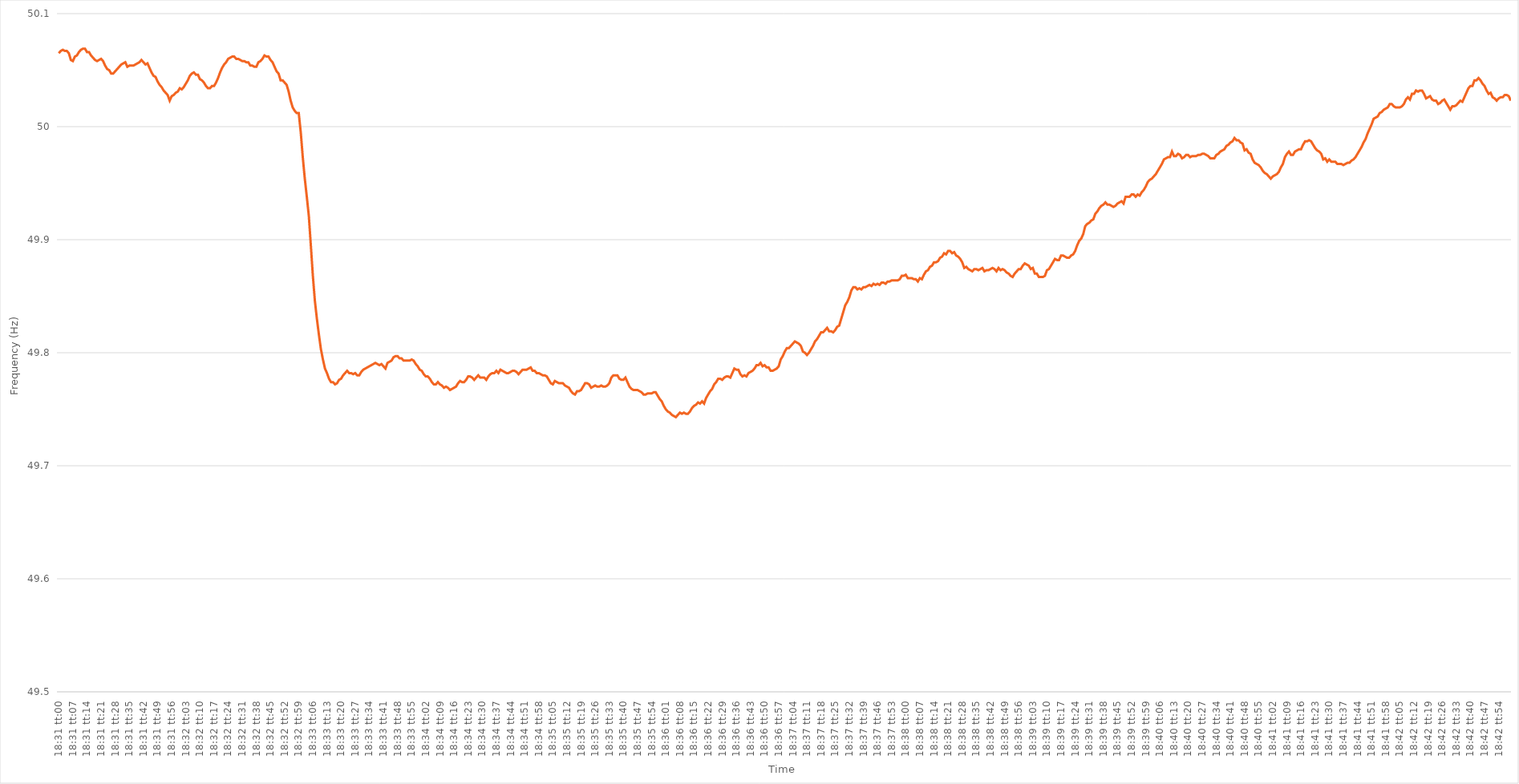
| Category | Series 0 |
|---|---|
| 0.7715277777777777 | 50.065 |
| 0.7715393518518519 | 50.067 |
| 0.771550925925926 | 50.068 |
| 0.7715624999999999 | 50.067 |
| 0.7715740740740741 | 50.067 |
| 0.7715856481481481 | 50.065 |
| 0.7715972222222223 | 50.059 |
| 0.7716087962962962 | 50.058 |
| 0.7716203703703703 | 50.062 |
| 0.7716319444444445 | 50.063 |
| 0.7716435185185185 | 50.066 |
| 0.7716550925925926 | 50.068 |
| 0.7716666666666666 | 50.069 |
| 0.7716782407407408 | 50.069 |
| 0.7716898148148149 | 50.066 |
| 0.7717013888888888 | 50.066 |
| 0.771712962962963 | 50.063 |
| 0.771724537037037 | 50.061 |
| 0.7717361111111112 | 50.059 |
| 0.7717476851851851 | 50.058 |
| 0.7717592592592593 | 50.059 |
| 0.7717708333333334 | 50.06 |
| 0.7717824074074073 | 50.058 |
| 0.7717939814814815 | 50.054 |
| 0.7718055555555555 | 50.051 |
| 0.7718171296296297 | 50.05 |
| 0.7718287037037036 | 50.047 |
| 0.7718402777777778 | 50.047 |
| 0.7718518518518519 | 50.049 |
| 0.7718634259259259 | 50.051 |
| 0.771875 | 50.053 |
| 0.771886574074074 | 50.055 |
| 0.7718981481481482 | 50.056 |
| 0.7719097222222223 | 50.057 |
| 0.7719212962962962 | 50.053 |
| 0.7719328703703704 | 50.054 |
| 0.7719444444444444 | 50.054 |
| 0.7719560185185186 | 50.054 |
| 0.7719675925925925 | 50.055 |
| 0.7719791666666667 | 50.056 |
| 0.7719907407407408 | 50.057 |
| 0.7720023148148148 | 50.059 |
| 0.7720138888888889 | 50.057 |
| 0.7720254629629629 | 50.055 |
| 0.7720370370370371 | 50.056 |
| 0.772048611111111 | 50.052 |
| 0.7720601851851852 | 50.048 |
| 0.7720717592592593 | 50.045 |
| 0.7720833333333333 | 50.044 |
| 0.7720949074074074 | 50.04 |
| 0.7721064814814814 | 50.037 |
| 0.7721180555555556 | 50.035 |
| 0.7721296296296297 | 50.032 |
| 0.7721412037037036 | 50.03 |
| 0.7721527777777778 | 50.028 |
| 0.7721643518518518 | 50.023 |
| 0.772175925925926 | 50.027 |
| 0.7721874999999999 | 50.028 |
| 0.7721990740740741 | 50.03 |
| 0.7722106481481482 | 50.031 |
| 0.7722222222222223 | 50.034 |
| 0.7722337962962963 | 50.033 |
| 0.7722453703703703 | 50.035 |
| 0.7722569444444445 | 50.038 |
| 0.7722685185185186 | 50.041 |
| 0.7722800925925926 | 50.045 |
| 0.7722916666666667 | 50.047 |
| 0.7723032407407407 | 50.048 |
| 0.7723148148148148 | 50.046 |
| 0.7723263888888888 | 50.046 |
| 0.772337962962963 | 50.042 |
| 0.7723495370370371 | 50.041 |
| 0.772361111111111 | 50.039 |
| 0.7723726851851852 | 50.036 |
| 0.7723842592592592 | 50.034 |
| 0.7723958333333334 | 50.034 |
| 0.7724074074074073 | 50.036 |
| 0.7724189814814815 | 50.036 |
| 0.7724305555555556 | 50.039 |
| 0.7724421296296297 | 50.043 |
| 0.7724537037037037 | 50.048 |
| 0.7724652777777777 | 50.052 |
| 0.7724768518518519 | 50.055 |
| 0.772488425925926 | 50.057 |
| 0.7725 | 50.06 |
| 0.7725115740740741 | 50.061 |
| 0.7725231481481482 | 50.062 |
| 0.7725347222222222 | 50.062 |
| 0.7725462962962962 | 50.06 |
| 0.7725578703703704 | 50.06 |
| 0.7725694444444445 | 50.059 |
| 0.7725810185185185 | 50.058 |
| 0.7725925925925926 | 50.058 |
| 0.7726041666666666 | 50.057 |
| 0.7726157407407408 | 50.057 |
| 0.7726273148148147 | 50.054 |
| 0.7726388888888889 | 50.054 |
| 0.772650462962963 | 50.053 |
| 0.7726620370370371 | 50.053 |
| 0.7726736111111111 | 50.057 |
| 0.7726851851851851 | 50.058 |
| 0.7726967592592593 | 50.06 |
| 0.7727083333333334 | 50.063 |
| 0.7727199074074074 | 50.062 |
| 0.7727314814814815 | 50.062 |
| 0.7727430555555556 | 50.059 |
| 0.7727546296296296 | 50.057 |
| 0.7727662037037036 | 50.053 |
| 0.7727777777777778 | 50.049 |
| 0.7727893518518519 | 50.047 |
| 0.7728009259259259 | 50.041 |
| 0.7728125 | 50.041 |
| 0.772824074074074 | 50.039 |
| 0.7728356481481482 | 50.037 |
| 0.7728472222222221 | 50.031 |
| 0.7728587962962963 | 50.023 |
| 0.7728703703703704 | 50.017 |
| 0.7728819444444445 | 50.014 |
| 0.7728935185185185 | 50.012 |
| 0.7729050925925925 | 50.012 |
| 0.7729166666666667 | 49.995 |
| 0.7729282407407408 | 49.973 |
| 0.7729398148148148 | 49.954 |
| 0.7729513888888889 | 49.938 |
| 0.772962962962963 | 49.921 |
| 0.772974537037037 | 49.895 |
| 0.772986111111111 | 49.868 |
| 0.7729976851851852 | 49.846 |
| 0.7730092592592593 | 49.83 |
| 0.7730208333333333 | 49.816 |
| 0.7730324074074074 | 49.803 |
| 0.7730439814814815 | 49.794 |
| 0.7730555555555556 | 49.786 |
| 0.7730671296296295 | 49.782 |
| 0.7730787037037037 | 49.777 |
| 0.7730902777777778 | 49.774 |
| 0.7731018518518519 | 49.774 |
| 0.7731134259259259 | 49.772 |
| 0.773125 | 49.773 |
| 0.7731365740740741 | 49.776 |
| 0.7731481481481483 | 49.777 |
| 0.7731597222222222 | 49.78 |
| 0.7731712962962963 | 49.782 |
| 0.7731828703703704 | 49.784 |
| 0.7731944444444444 | 49.782 |
| 0.7732060185185184 | 49.782 |
| 0.7732175925925926 | 49.781 |
| 0.7732291666666667 | 49.782 |
| 0.7732407407407407 | 49.78 |
| 0.7732523148148148 | 49.78 |
| 0.7732638888888889 | 49.783 |
| 0.773275462962963 | 49.785 |
| 0.7732870370370369 | 49.786 |
| 0.7732986111111111 | 49.787 |
| 0.7733101851851852 | 49.788 |
| 0.7733217592592593 | 49.789 |
| 0.7733333333333333 | 49.79 |
| 0.7733449074074074 | 49.791 |
| 0.7733564814814815 | 49.79 |
| 0.7733680555555557 | 49.789 |
| 0.7733796296296296 | 49.79 |
| 0.7733912037037037 | 49.788 |
| 0.7734027777777778 | 49.786 |
| 0.7734143518518519 | 49.791 |
| 0.7734259259259259 | 49.792 |
| 0.7734375 | 49.793 |
| 0.7734490740740741 | 49.796 |
| 0.7734606481481481 | 49.797 |
| 0.7734722222222222 | 49.797 |
| 0.7734837962962963 | 49.795 |
| 0.7734953703703704 | 49.795 |
| 0.7735069444444443 | 49.793 |
| 0.7735185185185185 | 49.793 |
| 0.7735300925925926 | 49.793 |
| 0.7735416666666667 | 49.793 |
| 0.7735532407407407 | 49.794 |
| 0.7735648148148148 | 49.793 |
| 0.7735763888888889 | 49.79 |
| 0.7735879629629631 | 49.788 |
| 0.773599537037037 | 49.785 |
| 0.7736111111111111 | 49.784 |
| 0.7736226851851852 | 49.781 |
| 0.7736342592592593 | 49.779 |
| 0.7736458333333333 | 49.779 |
| 0.7736574074074074 | 49.777 |
| 0.7736689814814816 | 49.774 |
| 0.7736805555555556 | 49.772 |
| 0.7736921296296296 | 49.772 |
| 0.7737037037037037 | 49.774 |
| 0.7737152777777778 | 49.772 |
| 0.7737268518518517 | 49.771 |
| 0.7737384259259259 | 49.769 |
| 0.77375 | 49.77 |
| 0.7737615740740741 | 49.769 |
| 0.7737731481481481 | 49.767 |
| 0.7737847222222222 | 49.768 |
| 0.7737962962962963 | 49.769 |
| 0.7738078703703705 | 49.77 |
| 0.7738194444444444 | 49.773 |
| 0.7738310185185185 | 49.775 |
| 0.7738425925925926 | 49.774 |
| 0.7738541666666667 | 49.774 |
| 0.7738657407407407 | 49.776 |
| 0.7738773148148148 | 49.779 |
| 0.773888888888889 | 49.779 |
| 0.773900462962963 | 49.778 |
| 0.773912037037037 | 49.776 |
| 0.7739236111111111 | 49.778 |
| 0.7739351851851852 | 49.78 |
| 0.7739467592592592 | 49.778 |
| 0.7739583333333333 | 49.778 |
| 0.7739699074074075 | 49.778 |
| 0.7739814814814815 | 49.776 |
| 0.7739930555555555 | 49.779 |
| 0.7740046296296296 | 49.781 |
| 0.7740162037037037 | 49.782 |
| 0.7740277777777779 | 49.782 |
| 0.7740393518518518 | 49.784 |
| 0.774050925925926 | 49.782 |
| 0.7740625 | 49.785 |
| 0.7740740740740741 | 49.784 |
| 0.7740856481481481 | 49.783 |
| 0.7740972222222222 | 49.782 |
| 0.7741087962962964 | 49.782 |
| 0.7741203703703704 | 49.783 |
| 0.7741319444444444 | 49.784 |
| 0.7741435185185185 | 49.784 |
| 0.7741550925925926 | 49.783 |
| 0.7741666666666666 | 49.781 |
| 0.7741782407407407 | 49.783 |
| 0.7741898148148149 | 49.785 |
| 0.7742013888888889 | 49.785 |
| 0.7742129629629629 | 49.785 |
| 0.774224537037037 | 49.786 |
| 0.7742361111111111 | 49.787 |
| 0.7742476851851853 | 49.784 |
| 0.7742592592592592 | 49.784 |
| 0.7742708333333334 | 49.782 |
| 0.7742824074074074 | 49.782 |
| 0.7742939814814815 | 49.781 |
| 0.7743055555555555 | 49.78 |
| 0.7743171296296296 | 49.78 |
| 0.7743287037037038 | 49.779 |
| 0.7743402777777778 | 49.776 |
| 0.7743518518518518 | 49.773 |
| 0.7743634259259259 | 49.772 |
| 0.774375 | 49.775 |
| 0.774386574074074 | 49.774 |
| 0.7743981481481481 | 49.773 |
| 0.7744097222222223 | 49.773 |
| 0.7744212962962963 | 49.773 |
| 0.7744328703703703 | 49.771 |
| 0.7744444444444444 | 49.77 |
| 0.7744560185185185 | 49.769 |
| 0.7744675925925927 | 49.766 |
| 0.7744791666666666 | 49.764 |
| 0.7744907407407408 | 49.763 |
| 0.7745023148148148 | 49.766 |
| 0.774513888888889 | 49.766 |
| 0.7745254629629629 | 49.767 |
| 0.774537037037037 | 49.77 |
| 0.7745486111111112 | 49.773 |
| 0.7745601851851852 | 49.773 |
| 0.7745717592592593 | 49.772 |
| 0.7745833333333333 | 49.769 |
| 0.7745949074074074 | 49.77 |
| 0.7746064814814814 | 49.771 |
| 0.7746180555555555 | 49.77 |
| 0.7746296296296297 | 49.77 |
| 0.7746412037037037 | 49.771 |
| 0.7746527777777777 | 49.77 |
| 0.7746643518518518 | 49.77 |
| 0.7746759259259259 | 49.771 |
| 0.7746875000000001 | 49.773 |
| 0.774699074074074 | 49.778 |
| 0.7747106481481482 | 49.78 |
| 0.7747222222222222 | 49.78 |
| 0.7747337962962964 | 49.78 |
| 0.7747453703703703 | 49.777 |
| 0.7747569444444444 | 49.776 |
| 0.7747685185185186 | 49.776 |
| 0.7747800925925926 | 49.778 |
| 0.7747916666666667 | 49.774 |
| 0.7748032407407407 | 49.77 |
| 0.7748148148148148 | 49.768 |
| 0.774826388888889 | 49.767 |
| 0.7748379629629629 | 49.767 |
| 0.7748495370370371 | 49.767 |
| 0.7748611111111111 | 49.766 |
| 0.7748726851851853 | 49.765 |
| 0.7748842592592592 | 49.763 |
| 0.7748958333333333 | 49.763 |
| 0.7749074074074075 | 49.764 |
| 0.7749189814814814 | 49.764 |
| 0.7749305555555556 | 49.764 |
| 0.7749421296296296 | 49.765 |
| 0.7749537037037038 | 49.765 |
| 0.7749652777777777 | 49.762 |
| 0.7749768518518518 | 49.759 |
| 0.774988425925926 | 49.757 |
| 0.775 | 49.753 |
| 0.7750115740740741 | 49.75 |
| 0.7750231481481481 | 49.748 |
| 0.7750347222222222 | 49.747 |
| 0.7750462962962964 | 49.745 |
| 0.7750578703703703 | 49.744 |
| 0.7750694444444445 | 49.743 |
| 0.7750810185185185 | 49.745 |
| 0.7750925925925927 | 49.747 |
| 0.7751041666666666 | 49.746 |
| 0.7751157407407407 | 49.747 |
| 0.7751273148148149 | 49.746 |
| 0.7751388888888888 | 49.746 |
| 0.775150462962963 | 49.748 |
| 0.775162037037037 | 49.751 |
| 0.7751736111111112 | 49.753 |
| 0.7751851851851851 | 49.754 |
| 0.7751967592592592 | 49.756 |
| 0.7752083333333334 | 49.755 |
| 0.7752199074074074 | 49.757 |
| 0.7752314814814815 | 49.755 |
| 0.7752430555555555 | 49.76 |
| 0.7752546296296297 | 49.763 |
| 0.7752662037037038 | 49.766 |
| 0.7752777777777777 | 49.768 |
| 0.7752893518518519 | 49.772 |
| 0.7753009259259259 | 49.774 |
| 0.7753125000000001 | 49.777 |
| 0.775324074074074 | 49.777 |
| 0.7753356481481481 | 49.776 |
| 0.7753472222222223 | 49.778 |
| 0.7753587962962962 | 49.779 |
| 0.7753703703703704 | 49.779 |
| 0.7753819444444444 | 49.778 |
| 0.7753935185185186 | 49.782 |
| 0.7754050925925925 | 49.786 |
| 0.7754166666666666 | 49.785 |
| 0.7754282407407408 | 49.785 |
| 0.7754398148148148 | 49.781 |
| 0.7754513888888889 | 49.779 |
| 0.7754629629629629 | 49.78 |
| 0.7754745370370371 | 49.779 |
| 0.7754861111111112 | 49.782 |
| 0.7754976851851851 | 49.783 |
| 0.7755092592592593 | 49.784 |
| 0.7755208333333333 | 49.786 |
| 0.7755324074074075 | 49.789 |
| 0.7755439814814814 | 49.789 |
| 0.7755555555555556 | 49.791 |
| 0.7755671296296297 | 49.788 |
| 0.7755787037037036 | 49.789 |
| 0.7755902777777778 | 49.787 |
| 0.7756018518518518 | 49.787 |
| 0.775613425925926 | 49.784 |
| 0.7756249999999999 | 49.784 |
| 0.775636574074074 | 49.785 |
| 0.7756481481481482 | 49.786 |
| 0.7756597222222222 | 49.788 |
| 0.7756712962962963 | 49.794 |
| 0.7756828703703703 | 49.797 |
| 0.7756944444444445 | 49.801 |
| 0.7757060185185186 | 49.804 |
| 0.7757175925925925 | 49.804 |
| 0.7757291666666667 | 49.806 |
| 0.7757407407407407 | 49.808 |
| 0.7757523148148149 | 49.81 |
| 0.7757638888888888 | 49.809 |
| 0.775775462962963 | 49.808 |
| 0.7757870370370371 | 49.806 |
| 0.775798611111111 | 49.801 |
| 0.7758101851851852 | 49.8 |
| 0.7758217592592592 | 49.798 |
| 0.7758333333333334 | 49.8 |
| 0.7758449074074073 | 49.803 |
| 0.7758564814814815 | 49.806 |
| 0.7758680555555556 | 49.81 |
| 0.7758796296296296 | 49.812 |
| 0.7758912037037037 | 49.815 |
| 0.7759027777777777 | 49.818 |
| 0.7759143518518519 | 49.818 |
| 0.775925925925926 | 49.82 |
| 0.7759375 | 49.822 |
| 0.7759490740740741 | 49.819 |
| 0.7759606481481481 | 49.819 |
| 0.7759722222222223 | 49.818 |
| 0.7759837962962962 | 49.82 |
| 0.7759953703703704 | 49.823 |
| 0.7760069444444445 | 49.824 |
| 0.7760185185185186 | 49.83 |
| 0.7760300925925926 | 49.836 |
| 0.7760416666666666 | 49.842 |
| 0.7760532407407408 | 49.845 |
| 0.7760648148148147 | 49.849 |
| 0.7760763888888889 | 49.855 |
| 0.776087962962963 | 49.858 |
| 0.776099537037037 | 49.858 |
| 0.7761111111111111 | 49.856 |
| 0.7761226851851851 | 49.857 |
| 0.7761342592592593 | 49.856 |
| 0.7761458333333334 | 49.858 |
| 0.7761574074074074 | 49.858 |
| 0.7761689814814815 | 49.859 |
| 0.7761805555555555 | 49.86 |
| 0.7761921296296297 | 49.859 |
| 0.7762037037037036 | 49.861 |
| 0.7762152777777778 | 49.86 |
| 0.7762268518518519 | 49.861 |
| 0.776238425925926 | 49.86 |
| 0.77625 | 49.862 |
| 0.776261574074074 | 49.862 |
| 0.7762731481481482 | 49.861 |
| 0.7762847222222223 | 49.863 |
| 0.7762962962962963 | 49.863 |
| 0.7763078703703704 | 49.864 |
| 0.7763194444444445 | 49.864 |
| 0.7763310185185185 | 49.864 |
| 0.7763425925925925 | 49.864 |
| 0.7763541666666667 | 49.865 |
| 0.7763657407407408 | 49.868 |
| 0.7763773148148148 | 49.868 |
| 0.7763888888888889 | 49.869 |
| 0.776400462962963 | 49.866 |
| 0.7764120370370371 | 49.866 |
| 0.776423611111111 | 49.866 |
| 0.7764351851851852 | 49.865 |
| 0.7764467592592593 | 49.865 |
| 0.7764583333333334 | 49.863 |
| 0.7764699074074074 | 49.866 |
| 0.7764814814814814 | 49.865 |
| 0.7764930555555556 | 49.869 |
| 0.7765046296296297 | 49.872 |
| 0.7765162037037037 | 49.873 |
| 0.7765277777777778 | 49.876 |
| 0.7765393518518519 | 49.877 |
| 0.7765509259259259 | 49.88 |
| 0.7765624999999999 | 49.88 |
| 0.7765740740740741 | 49.881 |
| 0.7765856481481482 | 49.884 |
| 0.7765972222222222 | 49.885 |
| 0.7766087962962963 | 49.888 |
| 0.7766203703703703 | 49.887 |
| 0.7766319444444445 | 49.89 |
| 0.7766435185185184 | 49.89 |
| 0.7766550925925926 | 49.888 |
| 0.7766666666666667 | 49.889 |
| 0.7766782407407408 | 49.886 |
| 0.7766898148148148 | 49.885 |
| 0.7767013888888888 | 49.883 |
| 0.776712962962963 | 49.88 |
| 0.7767245370370371 | 49.875 |
| 0.7767361111111111 | 49.876 |
| 0.7767476851851852 | 49.874 |
| 0.7767592592592593 | 49.873 |
| 0.7767708333333333 | 49.872 |
| 0.7767824074074073 | 49.874 |
| 0.7767939814814815 | 49.874 |
| 0.7768055555555556 | 49.873 |
| 0.7768171296296296 | 49.874 |
| 0.7768287037037037 | 49.875 |
| 0.7768402777777778 | 49.872 |
| 0.7768518518518519 | 49.873 |
| 0.7768634259259258 | 49.873 |
| 0.776875 | 49.874 |
| 0.7768865740740741 | 49.875 |
| 0.7768981481481482 | 49.874 |
| 0.7769097222222222 | 49.872 |
| 0.7769212962962962 | 49.875 |
| 0.7769328703703704 | 49.873 |
| 0.7769444444444445 | 49.874 |
| 0.7769560185185185 | 49.873 |
| 0.7769675925925926 | 49.871 |
| 0.7769791666666667 | 49.87 |
| 0.7769907407407407 | 49.868 |
| 0.7770023148148147 | 49.867 |
| 0.7770138888888889 | 49.87 |
| 0.777025462962963 | 49.872 |
| 0.777037037037037 | 49.874 |
| 0.7770486111111111 | 49.874 |
| 0.7770601851851852 | 49.877 |
| 0.7770717592592593 | 49.879 |
| 0.7770833333333332 | 49.878 |
| 0.7770949074074074 | 49.877 |
| 0.7771064814814815 | 49.874 |
| 0.7771180555555556 | 49.875 |
| 0.7771296296296296 | 49.87 |
| 0.7771412037037037 | 49.87 |
| 0.7771527777777778 | 49.867 |
| 0.777164351851852 | 49.867 |
| 0.7771759259259259 | 49.867 |
| 0.7771875 | 49.868 |
| 0.7771990740740741 | 49.873 |
| 0.7772106481481481 | 49.874 |
| 0.7772222222222221 | 49.877 |
| 0.7772337962962963 | 49.88 |
| 0.7772453703703704 | 49.883 |
| 0.7772569444444444 | 49.882 |
| 0.7772685185185185 | 49.882 |
| 0.7772800925925926 | 49.886 |
| 0.7772916666666667 | 49.886 |
| 0.7773032407407406 | 49.885 |
| 0.7773148148148148 | 49.884 |
| 0.7773263888888889 | 49.884 |
| 0.777337962962963 | 49.886 |
| 0.777349537037037 | 49.887 |
| 0.7773611111111111 | 49.89 |
| 0.7773726851851852 | 49.895 |
| 0.7773842592592594 | 49.899 |
| 0.7773958333333333 | 49.901 |
| 0.7774074074074074 | 49.905 |
| 0.7774189814814815 | 49.912 |
| 0.7774305555555556 | 49.914 |
| 0.7774421296296296 | 49.915 |
| 0.7774537037037037 | 49.917 |
| 0.7774652777777779 | 49.918 |
| 0.7774768518518519 | 49.923 |
| 0.7774884259259259 | 49.925 |
| 0.7775 | 49.928 |
| 0.7775115740740741 | 49.93 |
| 0.777523148148148 | 49.931 |
| 0.7775347222222222 | 49.933 |
| 0.7775462962962963 | 49.931 |
| 0.7775578703703704 | 49.931 |
| 0.7775694444444444 | 49.93 |
| 0.7775810185185185 | 49.929 |
| 0.7775925925925926 | 49.93 |
| 0.7776041666666668 | 49.932 |
| 0.7776157407407407 | 49.933 |
| 0.7776273148148148 | 49.934 |
| 0.7776388888888889 | 49.932 |
| 0.777650462962963 | 49.938 |
| 0.777662037037037 | 49.938 |
| 0.7776736111111111 | 49.938 |
| 0.7776851851851853 | 49.94 |
| 0.7776967592592593 | 49.94 |
| 0.7777083333333333 | 49.938 |
| 0.7777199074074074 | 49.94 |
| 0.7777314814814815 | 49.939 |
| 0.7777430555555555 | 49.942 |
| 0.7777546296296296 | 49.944 |
| 0.7777662037037038 | 49.947 |
| 0.7777777777777778 | 49.951 |
| 0.7777893518518518 | 49.953 |
| 0.7778009259259259 | 49.954 |
| 0.7778125 | 49.956 |
| 0.7778240740740742 | 49.958 |
| 0.7778356481481481 | 49.961 |
| 0.7778472222222222 | 49.964 |
| 0.7778587962962963 | 49.967 |
| 0.7778703703703704 | 49.971 |
| 0.7778819444444444 | 49.972 |
| 0.7778935185185185 | 49.973 |
| 0.7779050925925927 | 49.973 |
| 0.7779166666666667 | 49.978 |
| 0.7779282407407407 | 49.974 |
| 0.7779398148148148 | 49.974 |
| 0.7779513888888889 | 49.976 |
| 0.7779629629629629 | 49.975 |
| 0.777974537037037 | 49.972 |
| 0.7779861111111112 | 49.973 |
| 0.7779976851851852 | 49.975 |
| 0.7780092592592592 | 49.975 |
| 0.7780208333333333 | 49.973 |
| 0.7780324074074074 | 49.974 |
| 0.7780439814814816 | 49.974 |
| 0.7780555555555555 | 49.974 |
| 0.7780671296296297 | 49.975 |
| 0.7780787037037037 | 49.975 |
| 0.7780902777777778 | 49.976 |
| 0.7781018518518518 | 49.976 |
| 0.7781134259259259 | 49.975 |
| 0.7781250000000001 | 49.974 |
| 0.7781365740740741 | 49.972 |
| 0.7781481481481481 | 49.972 |
| 0.7781597222222222 | 49.972 |
| 0.7781712962962963 | 49.975 |
| 0.7781828703703703 | 49.976 |
| 0.7781944444444444 | 49.978 |
| 0.7782060185185186 | 49.979 |
| 0.7782175925925926 | 49.98 |
| 0.7782291666666666 | 49.983 |
| 0.7782407407407407 | 49.984 |
| 0.7782523148148148 | 49.986 |
| 0.778263888888889 | 49.987 |
| 0.7782754629629629 | 49.99 |
| 0.778287037037037 | 49.988 |
| 0.7782986111111111 | 49.988 |
| 0.7783101851851852 | 49.986 |
| 0.7783217592592592 | 49.985 |
| 0.7783333333333333 | 49.979 |
| 0.7783449074074075 | 49.98 |
| 0.7783564814814815 | 49.977 |
| 0.7783680555555555 | 49.976 |
| 0.7783796296296296 | 49.971 |
| 0.7783912037037037 | 49.968 |
| 0.7784027777777777 | 49.967 |
| 0.7784143518518518 | 49.966 |
| 0.778425925925926 | 49.964 |
| 0.7784375 | 49.961 |
| 0.778449074074074 | 49.959 |
| 0.7784606481481481 | 49.958 |
| 0.7784722222222222 | 49.956 |
| 0.7784837962962964 | 49.954 |
| 0.7784953703703703 | 49.956 |
| 0.7785069444444445 | 49.957 |
| 0.7785185185185185 | 49.958 |
| 0.7785300925925926 | 49.96 |
| 0.7785416666666666 | 49.964 |
| 0.7785532407407407 | 49.967 |
| 0.7785648148148149 | 49.973 |
| 0.7785763888888889 | 49.976 |
| 0.778587962962963 | 49.978 |
| 0.778599537037037 | 49.975 |
| 0.7786111111111111 | 49.975 |
| 0.7786226851851853 | 49.978 |
| 0.7786342592592592 | 49.979 |
| 0.7786458333333334 | 49.98 |
| 0.7786574074074074 | 49.98 |
| 0.7786689814814814 | 49.984 |
| 0.7786805555555555 | 49.987 |
| 0.7786921296296296 | 49.987 |
| 0.7787037037037038 | 49.988 |
| 0.7787152777777777 | 49.987 |
| 0.7787268518518519 | 49.984 |
| 0.7787384259259259 | 49.981 |
| 0.77875 | 49.979 |
| 0.778761574074074 | 49.978 |
| 0.7787731481481481 | 49.976 |
| 0.7787847222222223 | 49.971 |
| 0.7787962962962963 | 49.972 |
| 0.7788078703703704 | 49.969 |
| 0.7788194444444444 | 49.971 |
| 0.7788310185185185 | 49.969 |
| 0.7788425925925927 | 49.969 |
| 0.7788541666666666 | 49.969 |
| 0.7788657407407408 | 49.967 |
| 0.7788773148148148 | 49.967 |
| 0.778888888888889 | 49.967 |
| 0.7789004629629629 | 49.966 |
| 0.778912037037037 | 49.967 |
| 0.7789236111111112 | 49.968 |
| 0.7789351851851851 | 49.968 |
| 0.7789467592592593 | 49.97 |
| 0.7789583333333333 | 49.971 |
| 0.7789699074074075 | 49.973 |
| 0.7789814814814814 | 49.976 |
| 0.7789930555555555 | 49.979 |
| 0.7790046296296297 | 49.982 |
| 0.7790162037037037 | 49.986 |
| 0.7790277777777778 | 49.989 |
| 0.7790393518518518 | 49.994 |
| 0.779050925925926 | 49.998 |
| 0.7790625000000001 | 50.002 |
| 0.779074074074074 | 50.007 |
| 0.7790856481481482 | 50.008 |
| 0.7790972222222222 | 50.009 |
| 0.7791087962962964 | 50.012 |
| 0.7791203703703703 | 50.013 |
| 0.7791319444444444 | 50.015 |
| 0.7791435185185186 | 50.016 |
| 0.7791550925925925 | 50.017 |
| 0.7791666666666667 | 50.02 |
| 0.7791782407407407 | 50.02 |
| 0.7791898148148149 | 50.018 |
| 0.7792013888888888 | 50.017 |
| 0.7792129629629629 | 50.017 |
| 0.7792245370370371 | 50.017 |
| 0.7792361111111111 | 50.018 |
| 0.7792476851851852 | 50.02 |
| 0.7792592592592592 | 50.024 |
| 0.7792708333333334 | 50.026 |
| 0.7792824074074075 | 50.024 |
| 0.7792939814814814 | 50.029 |
| 0.7793055555555556 | 50.029 |
| 0.7793171296296296 | 50.032 |
| 0.7793287037037038 | 50.031 |
| 0.7793402777777777 | 50.032 |
| 0.7793518518518519 | 50.032 |
| 0.779363425925926 | 50.029 |
| 0.7793749999999999 | 50.025 |
| 0.7793865740740741 | 50.026 |
| 0.7793981481481481 | 50.027 |
| 0.7794097222222223 | 50.024 |
| 0.7794212962962962 | 50.023 |
| 0.7794328703703703 | 50.023 |
| 0.7794444444444445 | 50.02 |
| 0.7794560185185185 | 50.021 |
| 0.7794675925925926 | 50.023 |
| 0.7794791666666666 | 50.024 |
| 0.7794907407407408 | 50.021 |
| 0.7795023148148149 | 50.018 |
| 0.7795138888888888 | 50.015 |
| 0.779525462962963 | 50.018 |
| 0.779537037037037 | 50.018 |
| 0.7795486111111112 | 50.019 |
| 0.7795601851851851 | 50.021 |
| 0.7795717592592593 | 50.023 |
| 0.7795833333333334 | 50.022 |
| 0.7795949074074073 | 50.026 |
| 0.7796064814814815 | 50.03 |
| 0.7796180555555555 | 50.034 |
| 0.7796296296296297 | 50.036 |
| 0.7796412037037036 | 50.036 |
| 0.7796527777777778 | 50.041 |
| 0.7796643518518519 | 50.041 |
| 0.7796759259259259 | 50.043 |
| 0.7796875 | 50.041 |
| 0.779699074074074 | 50.038 |
| 0.7797106481481482 | 50.036 |
| 0.7797222222222223 | 50.032 |
| 0.7797337962962962 | 50.029 |
| 0.7797453703703704 | 50.03 |
| 0.7797569444444444 | 50.026 |
| 0.7797685185185186 | 50.025 |
| 0.7797800925925925 | 50.023 |
| 0.7797916666666667 | 50.025 |
| 0.7798032407407408 | 50.026 |
| 0.7798148148148147 | 50.026 |
| 0.7798263888888889 | 50.028 |
| 0.7798379629629629 | 50.028 |
| 0.7798495370370371 | 50.027 |
| 0.779861111111111 | 50.023 |